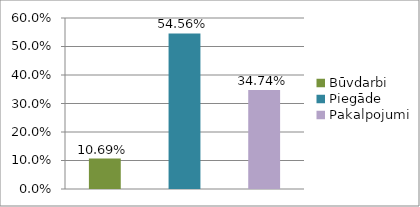
| Category | Series 0 |
|---|---|
| Būvdarbi | 0.107 |
| Piegāde | 0.546 |
| Pakalpojumi | 0.347 |